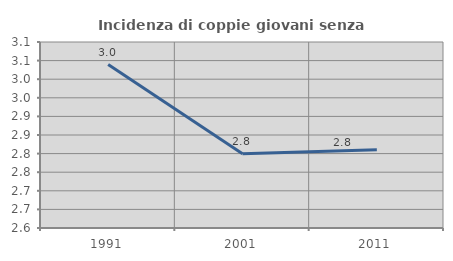
| Category | Incidenza di coppie giovani senza figli |
|---|---|
| 1991.0 | 3.04 |
| 2001.0 | 2.799 |
| 2011.0 | 2.811 |